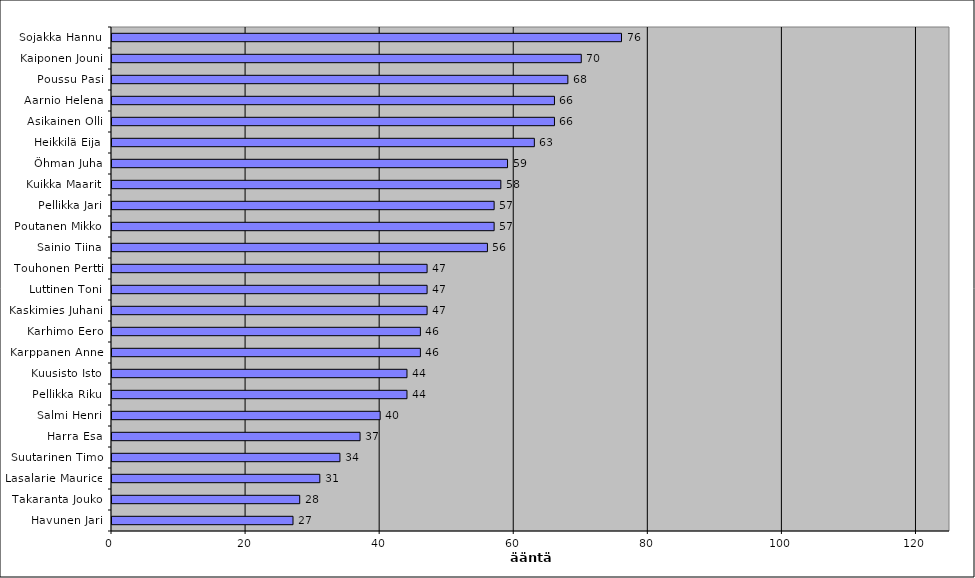
| Category | Series 0 |
|---|---|
| Sojakka Hannu | 76 |
| Kaiponen Jouni | 70 |
| Poussu Pasi | 68 |
| Aarnio Helena | 66 |
| Asikainen Olli | 66 |
| Heikkilä Eija | 63 |
| Öhman Juha | 59 |
| Kuikka Maarit | 58 |
| Pellikka Jari | 57 |
| Poutanen Mikko | 57 |
| Sainio Tiina | 56 |
| Touhonen Pertti | 47 |
| Luttinen Toni | 47 |
| Kaskimies Juhani | 47 |
| Karhimo Eero | 46 |
| Karppanen Anne | 46 |
| Kuusisto Isto | 44 |
| Pellikka Riku | 44 |
| Salmi Henri | 40 |
| Harra Esa | 37 |
| Suutarinen Timo | 34 |
| Lasalarie Maurice | 31 |
| Takaranta Jouko | 28 |
| Havunen Jari | 27 |